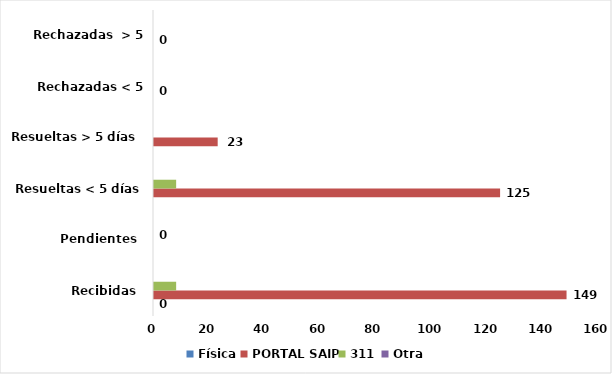
| Category | Física | PORTAL SAIP | 311 | Otra |
|---|---|---|---|---|
| Recibidas  | 0 | 149 | 8 | 0 |
| Pendientes  | 0 | 0 | 0 | 0 |
| Resueltas < 5 días | 0 | 125 | 8 | 0 |
| Resueltas > 5 días  | 0 | 23 | 0 | 0 |
| Rechazadas < 5 días  | 0 | 0 | 0 | 0 |
| Rechazadas  > 5 días | 0 | 0 | 0 | 0 |